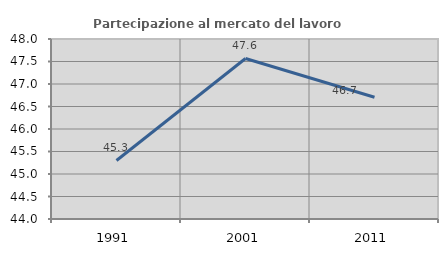
| Category | Partecipazione al mercato del lavoro  femminile |
|---|---|
| 1991.0 | 45.3 |
| 2001.0 | 47.568 |
| 2011.0 | 46.705 |